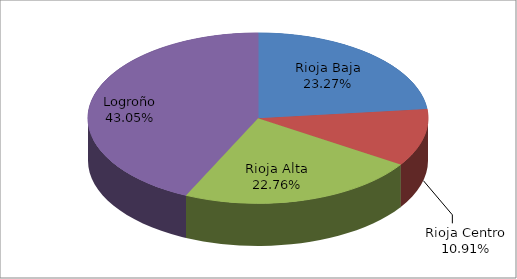
| Category | Series 0 |
|---|---|
| Rioja Baja | 819 |
| Rioja Centro | 384 |
| Rioja Alta | 801 |
| Logroño | 1515 |